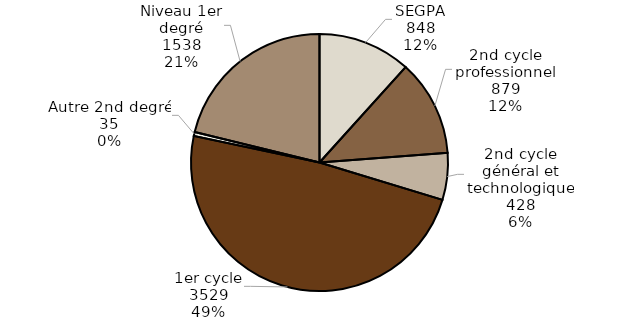
| Category | Series 0 |
|---|---|
| SEGPA | 848 |
| 2nd cycle professionnel | 879 |
| 2nd cycle général et technologique | 428 |
| 1er cycle | 3529 |
| Autre 2nd degré | 35 |
| Niveau 1er degré | 1538 |